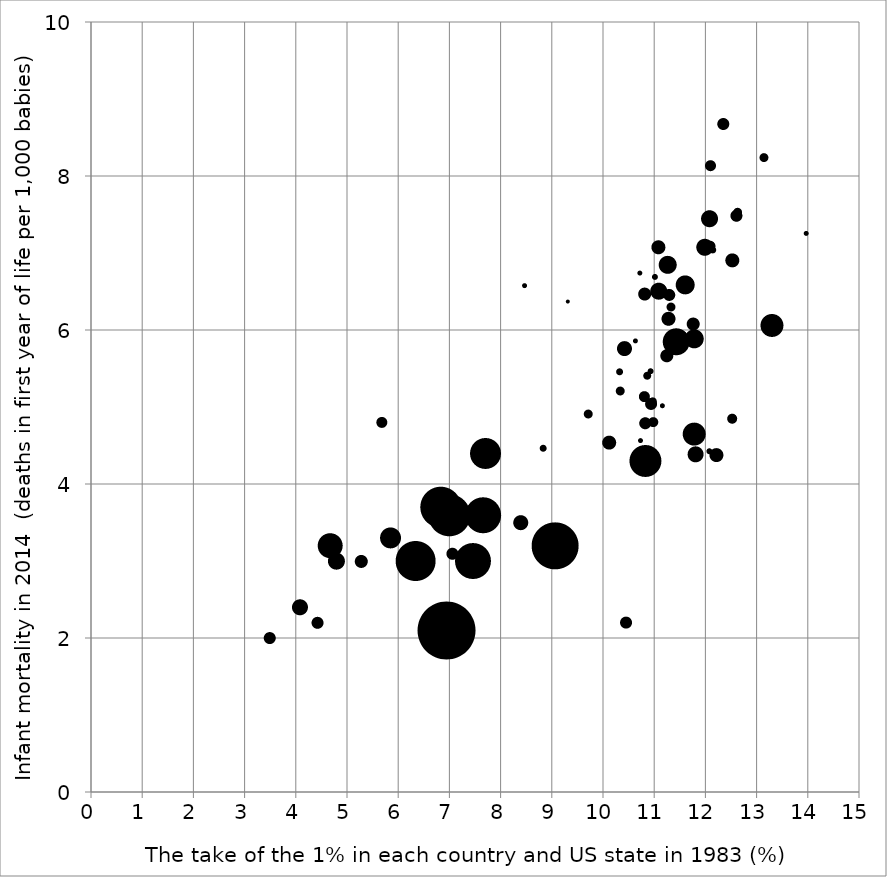
| Category | Series 0 |
|---|---|
| 12.342149 | 8.68 |
| 8.4618807 | 6.58 |
| 11.272208 | 6.15 |
| 12.627508 | 7.53 |
| 10.827101 | 4.3 |
| 10.823525 | 4.79 |
| 12.519849 | 4.85 |
| 10.718918 | 6.74 |
| 13.960412 | 7.26 |
| 13.298127 | 6.06 |
| 12.073452 | 7.45 |
| 8.8225587 | 4.47 |
| 10.319641 | 5.46 |
| 11.599077 | 6.59 |
| 11.073858 | 7.08 |
| 10.971814 | 4.81 |
| 11.324685 | 6.3 |
| 12.086685 | 7.09 |
| 12.596983 | 7.49 |
| 11.013192 | 6.69 |
| 10.809328 | 6.47 |
| 12.208504 | 4.38 |
| 11.079764 | 6.51 |
| 10.938519 | 5.04 |
| 13.142256 | 8.24 |
| 11.757833 | 6.08 |
| 10.921436 | 5.47 |
| 10.963338 | 5.08 |
| 10.332483 | 5.21 |
| 10.759662 | 4.31 |
| 11.801322 | 4.39 |
| 10.857477 | 5.41 |
| 11.7783 | 4.65 |
| 11.979431 | 7.08 |
| 11.154256 | 5.02 |
| 11.258063 | 6.85 |
| 12.09054 | 8.14 |
| 10.800268 | 5.14 |
| 11.774806 | 5.89 |
| 12.069936 | 4.43 |
| 11.285991 | 6.46 |
| 10.630249 | 5.86 |
| 12.516923 | 6.91 |
| 11.42572 | 5.85 |
| 9.7092366 | 4.91 |
| 10.723032 | 4.57 |
| 10.41725 | 5.76 |
| 10.116898 | 4.54 |
| 12.142691 | 7.04 |
| 11.23925 | 5.67 |
| 9.311722 | 6.37 |
| 4.67 | 3.2 |
| 7.7 | 4.4 |
| 5.27 | 3 |
| 3.49 | 2 |
| 6.99 | 3.6 |
| 9.06 | 3.2 |
| 7.05 | 3.1 |
| 6.34 | 3 |
| 6.94 | 2.1 |
| 7.46 | 3 |
| 5.85 | 3.3 |
| 5.68 | 4.8 |
| 4.42 | 2.2 |
| 4.79 | 3 |
| 10.45 | 2.2 |
| 7.65 | 3.6 |
| 4.08 | 2.4 |
| 8.39 | 3.5 |
| 6.83 | 3.7 |